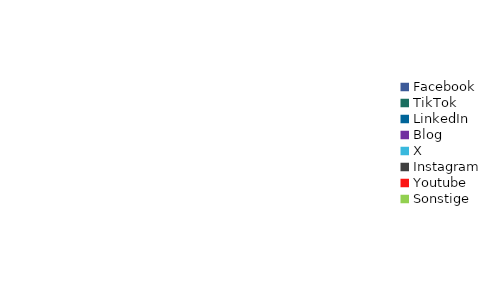
| Category | Series 0 |
|---|---|
| Facebook | 0 |
| TikTok | 0 |
| LinkedIn | 0 |
| Blog | 0 |
| X | 0 |
| Instagram | 0 |
| Youtube | 0 |
| Sonstige | 0 |